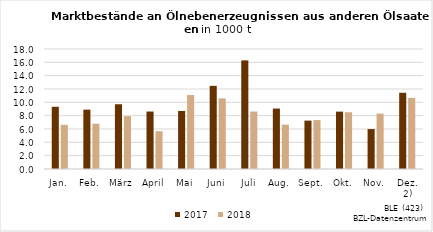
| Category | 2017 | 2018 |
|---|---|---|
| Jan. | 9.334 | 6.621 |
| Feb. | 8.902 | 6.786 |
| März | 9.713 | 7.922 |
| April | 8.621 | 5.671 |
| Mai | 8.709 | 11.092 |
| Juni | 12.473 | 10.6 |
| Juli | 16.29 | 8.626 |
| Aug. | 9.066 | 6.652 |
| Sept. | 7.258 | 7.341 |
| Okt. | 8.606 | 8.512 |
| Nov. | 5.99 | 8.312 |
| Dez. 2) | 11.432 | 10.663 |